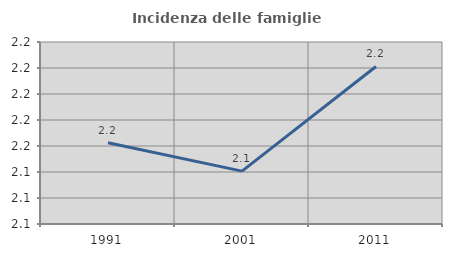
| Category | Incidenza delle famiglie numerose |
|---|---|
| 1991.0 | 2.162 |
| 2001.0 | 2.141 |
| 2011.0 | 2.221 |